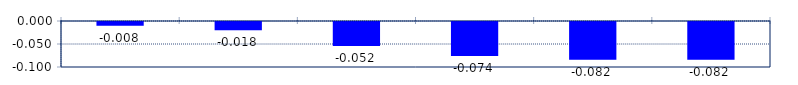
| Category | Series 0 |
|---|---|
| 0 | -0.008 |
| 1 | -0.018 |
| 2 | -0.052 |
| 3 | -0.074 |
| 4 | -0.082 |
| 5 | -0.082 |